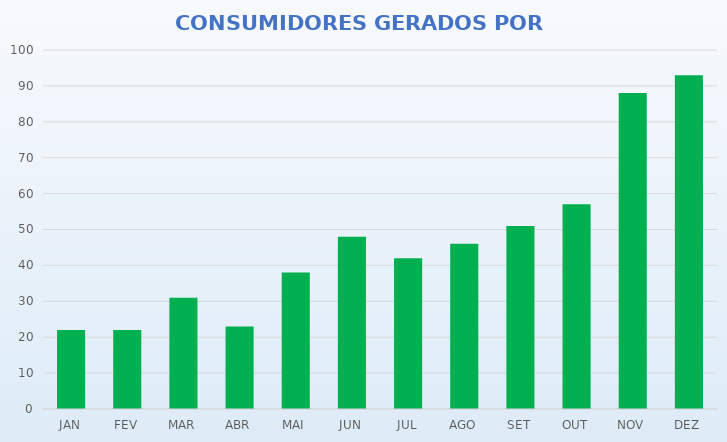
| Category | TOTAL GERAL |
|---|---|
| JAN | 22 |
| FEV | 22 |
| MAR | 31 |
| ABR | 23 |
| MAI | 38 |
| JUN | 48 |
| JUL | 42 |
| AGO | 46 |
| SET | 51 |
| OUT | 57 |
| NOV | 88 |
| DEZ | 93 |